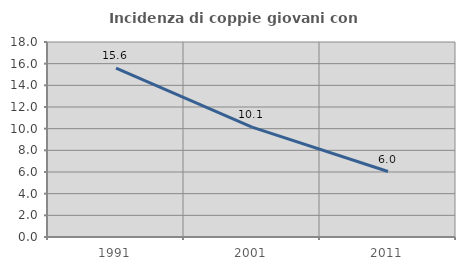
| Category | Incidenza di coppie giovani con figli |
|---|---|
| 1991.0 | 15.599 |
| 2001.0 | 10.145 |
| 2011.0 | 6.046 |